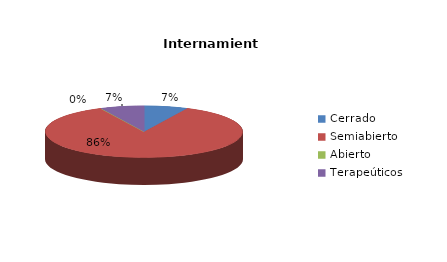
| Category | Series 0 |
|---|---|
| Cerrado | 1 |
| Semiabierto | 12 |
| Abierto | 0 |
| Terapeúticos | 1 |